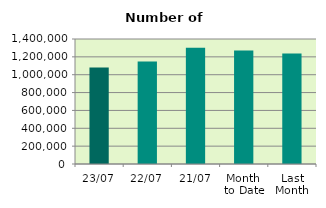
| Category | Series 0 |
|---|---|
| 23/07 | 1080702 |
| 22/07 | 1148708 |
| 21/07 | 1301538 |
| Month 
to Date | 1270313.529 |
| Last
Month | 1237407.909 |